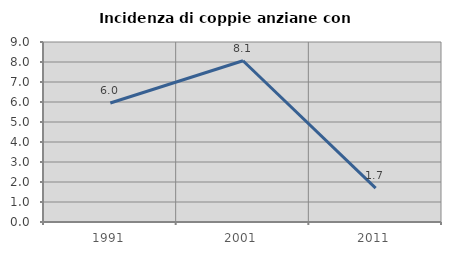
| Category | Incidenza di coppie anziane con figli |
|---|---|
| 1991.0 | 5.952 |
| 2001.0 | 8.065 |
| 2011.0 | 1.695 |